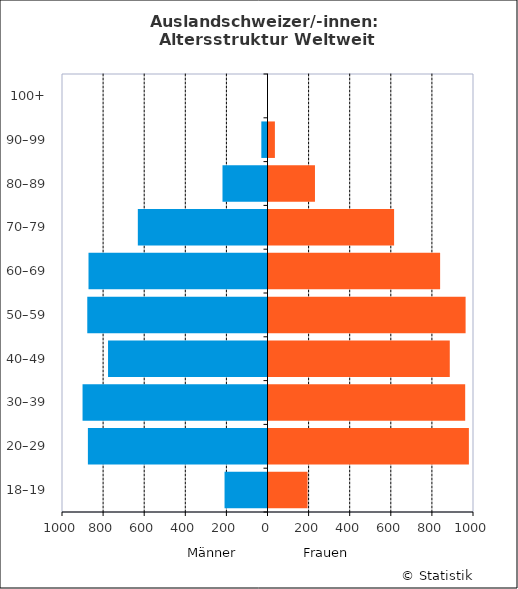
| Category | Männer | Frauen |
|---|---|---|
| 18–19 | -209 | 195 |
| 20–29 | -874 | 980 |
| 30–39 | -900 | 962 |
| 40–49 | -776 | 887 |
| 50–59 | -877 | 964 |
| 60–69 | -871 | 840 |
| 70–79 | -631 | 616 |
| 80–89 | -219 | 231 |
| 90–99 | -30 | 36 |
| 100+ | 0 | 0 |